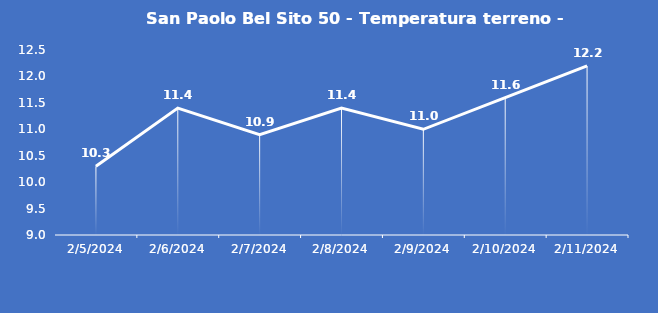
| Category | San Paolo Bel Sito 50 - Temperatura terreno - Grezzo (°C) |
|---|---|
| 2/5/24 | 10.3 |
| 2/6/24 | 11.4 |
| 2/7/24 | 10.9 |
| 2/8/24 | 11.4 |
| 2/9/24 | 11 |
| 2/10/24 | 11.6 |
| 2/11/24 | 12.2 |